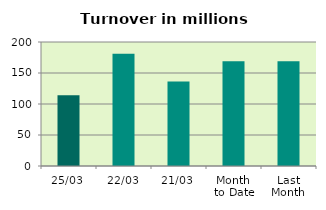
| Category | Series 0 |
|---|---|
| 25/03 | 113.942 |
| 22/03 | 180.985 |
| 21/03 | 136.354 |
| Month 
to Date | 169.081 |
| Last
Month | 168.971 |